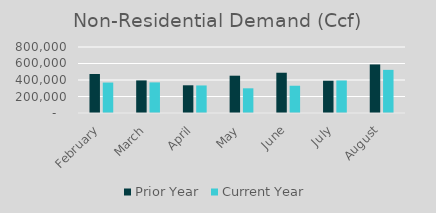
| Category | Prior Year | Current Year |
|---|---|---|
| February | 472459.203 | 369131.684 |
| March | 394966.802 | 370961.851 |
| April | 335781.44 | 333800.488 |
| May | 452130.67 | 299245.56 |
| June | 488107.52 | 330441.187 |
| July | 390975.65 | 394304.316 |
| August | 588468.22 | 522963.473 |